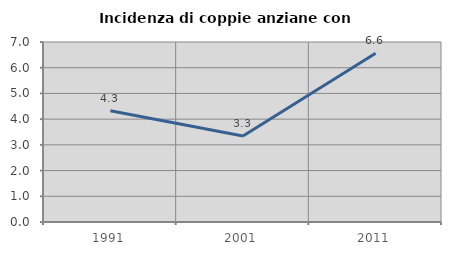
| Category | Incidenza di coppie anziane con figli |
|---|---|
| 1991.0 | 4.327 |
| 2001.0 | 3.342 |
| 2011.0 | 6.562 |